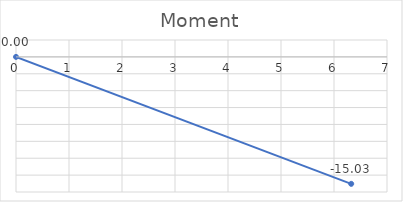
| Category | Series 0 |
|---|---|
| 0.0 | 0 |
| 6.324555320336759 | -15.034 |